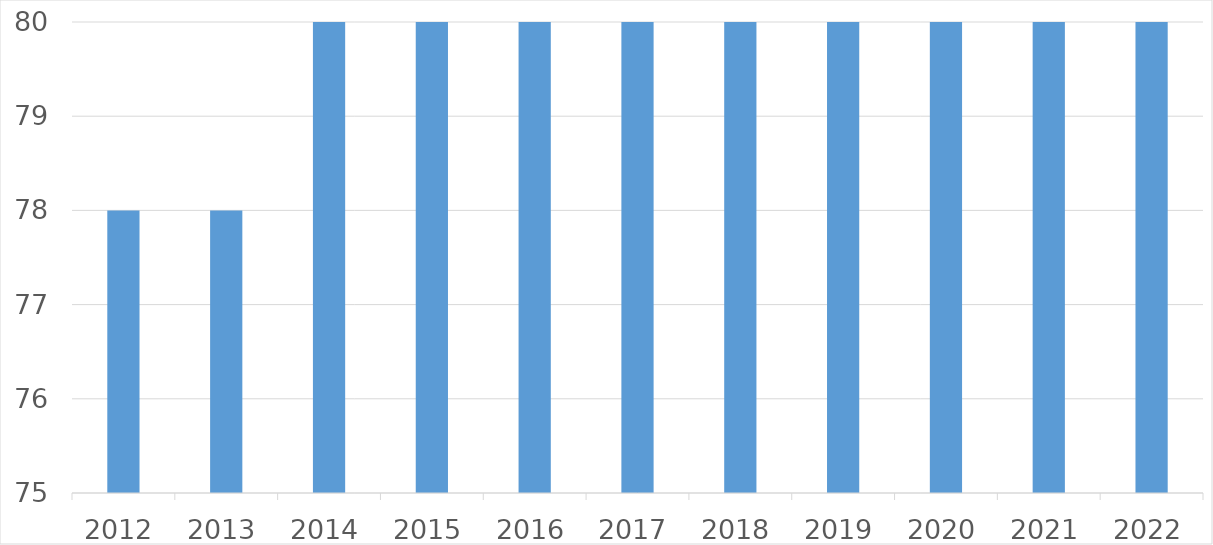
| Category | Series 0 |
|---|---|
| 2012 | 78 |
| 2013 | 78 |
| 2014 | 80 |
| 2015 | 80 |
| 2016 | 80 |
| 2017 | 80 |
| 2018 | 80 |
| 2019 | 80 |
| 2020 | 80 |
| 2021 | 80 |
| 2022 | 80 |